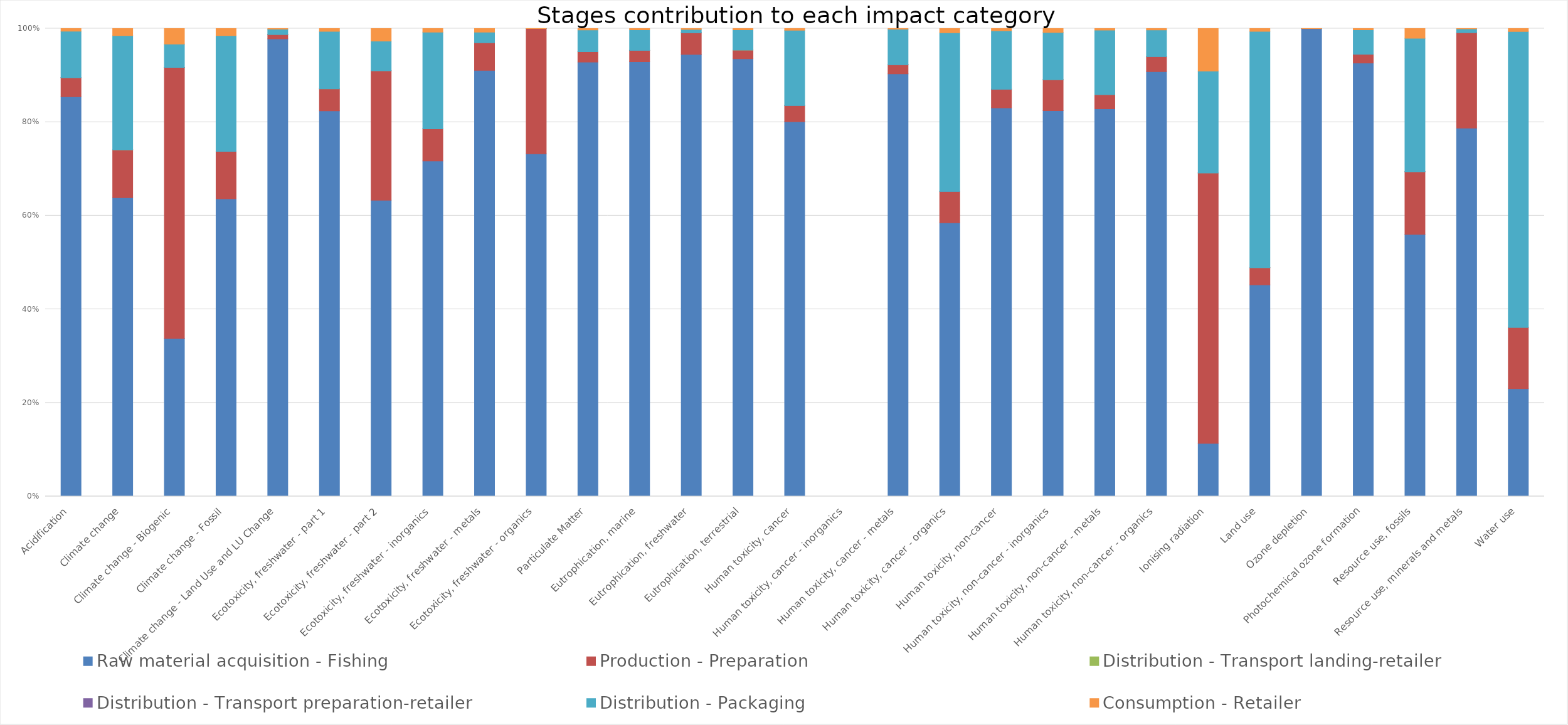
| Category | Raw material acquisition - Fishing | Production - Preparation | Distribution - Transport landing-retailer | Distribution - Transport preparation-retailer | Distribution - Packaging | Consumption - Retailer |
|---|---|---|---|---|---|---|
| Acidification | 0.854 | 0.041 | 0 | 0 | 0.099 | 0.006 |
| Climate change | 0.638 | 0.102 | 0 | 0 | 0.244 | 0.015 |
| Climate change - Biogenic | 0.338 | 0.579 | 0 | 0 | 0.05 | 0.033 |
| Climate change - Fossil | 0.636 | 0.101 | 0 | 0 | 0.247 | 0.015 |
| Climate change - Land Use and LU Change | 0.978 | 0.009 | 0 | 0 | 0.011 | 0.001 |
| Ecotoxicity, freshwater - part 1 | 0.824 | 0.047 | 0 | 0 | 0.123 | 0.006 |
| Ecotoxicity, freshwater - part 2 | 0.633 | 0.277 | 0 | 0 | 0.063 | 0.027 |
| Ecotoxicity, freshwater - inorganics | 0.717 | 0.069 | 0 | 0 | 0.207 | 0.008 |
| Ecotoxicity, freshwater - metals | 0.911 | 0.059 | 0 | 0 | 0.022 | 0.008 |
| Ecotoxicity, freshwater - organics | 0.732 | 0.268 | 0 | 0 | 0 | 0 |
| Particulate Matter | 0.928 | 0.022 | 0 | 0 | 0.046 | 0.003 |
| Eutrophication, marine | 0.929 | 0.024 | 0 | 0 | 0.044 | 0.003 |
| Eutrophication, freshwater | 0.945 | 0.046 | 0 | 0 | 0.007 | 0.002 |
| Eutrophication, terrestrial | 0.935 | 0.019 | 0 | 0 | 0.043 | 0.003 |
| Human toxicity, cancer | 0.801 | 0.035 | 0 | 0 | 0.161 | 0.004 |
| Human toxicity, cancer - inorganics | 0 | 0 | 0 | 0 | 0 | 0 |
| Human toxicity, cancer - metals | 0.903 | 0.02 | 0 | 0 | 0.076 | 0.001 |
| Human toxicity, cancer - organics | 0.585 | 0.067 | 0 | 0 | 0.339 | 0.009 |
| Human toxicity, non-cancer | 0.83 | 0.04 | 0 | 0 | 0.125 | 0.005 |
| Human toxicity, non-cancer - inorganics | 0.824 | 0.066 | 0 | 0 | 0.101 | 0.008 |
| Human toxicity, non-cancer - metals | 0.828 | 0.031 | 0 | 0 | 0.138 | 0.003 |
| Human toxicity, non-cancer - organics | 0.908 | 0.032 | 0 | 0 | 0.057 | 0.003 |
| Ionising radiation | 0.113 | 0.578 | 0 | 0 | 0.218 | 0.091 |
| Land use | 0.452 | 0.037 | 0 | 0 | 0.505 | 0.006 |
| Ozone depletion | 1 | 0 | 0 | 0 | 0 | 0 |
| Photochemical ozone formation | 0.926 | 0.019 | 0 | 0 | 0.052 | 0.003 |
| Resource use, fossils | 0.56 | 0.134 | 0 | 0 | 0.285 | 0.021 |
| Resource use, minerals and metals | 0.787 | 0.204 | 0 | 0 | 0.008 | 0.001 |
| Water use | 0.23 | 0.131 | 0 | 0 | 0.632 | 0.006 |